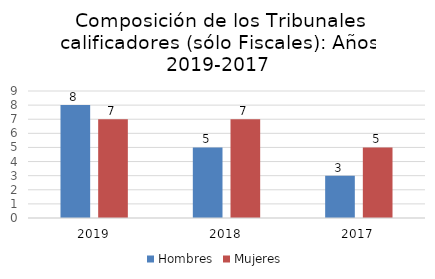
| Category | Hombres | Mujeres |
|---|---|---|
| 0 | 8 | 7 |
| 1 | 5 | 7 |
| 2 | 3 | 5 |